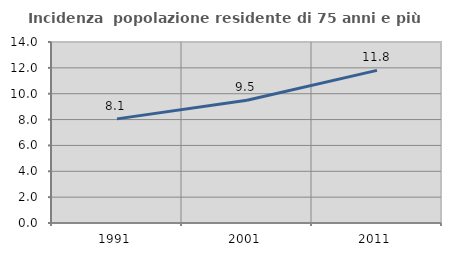
| Category | Incidenza  popolazione residente di 75 anni e più |
|---|---|
| 1991.0 | 8.054 |
| 2001.0 | 9.501 |
| 2011.0 | 11.803 |